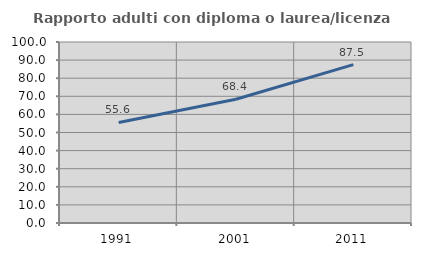
| Category | Rapporto adulti con diploma o laurea/licenza media  |
|---|---|
| 1991.0 | 55.556 |
| 2001.0 | 68.354 |
| 2011.0 | 87.5 |